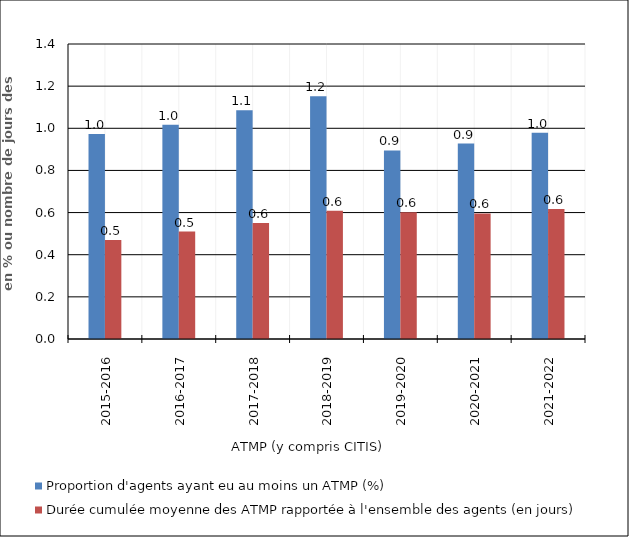
| Category | Proportion d'agents ayant eu au moins un ATMP (%) | Durée cumulée moyenne des ATMP rapportée à l'ensemble des agents (en jours) |
|---|---|---|
| 2015-2016 | 0.973 | 0.47 |
| 2016-2017 | 1.017 | 0.51 |
| 2017-2018 | 1.085 | 0.55 |
| 2018-2019 | 1.152 | 0.609 |
| 2019-2020 | 0.895 | 0.601 |
| 2020-2021 | 0.928 | 0.596 |
| 2021-2022 | 0.979 | 0.617 |